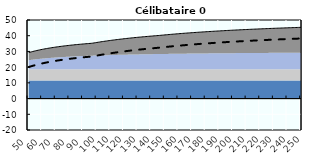
| Category | Coin fiscal moyen (somme des composantes) | Taux moyen d'imposition net en % du salaire brut |
|---|---|---|
| 50.0 | 29.264 | 20.068 |
| 51.0 | 29.505 | 20.341 |
| 52.0 | 29.738 | 20.604 |
| 53.0 | 29.962 | 20.857 |
| 54.0 | 30.177 | 21.1 |
| 55.0 | 30.385 | 21.335 |
| 56.0 | 30.585 | 21.561 |
| 57.0 | 30.778 | 21.779 |
| 58.0 | 30.964 | 21.99 |
| 59.0 | 31.144 | 22.193 |
| 60.0 | 31.319 | 22.39 |
| 61.0 | 31.487 | 22.58 |
| 62.0 | 31.65 | 22.765 |
| 63.0 | 31.808 | 22.943 |
| 64.0 | 31.961 | 23.116 |
| 65.0 | 32.109 | 23.283 |
| 66.0 | 32.253 | 23.445 |
| 67.0 | 32.392 | 23.603 |
| 68.0 | 32.527 | 23.756 |
| 69.0 | 32.659 | 23.904 |
| 70.0 | 32.786 | 24.049 |
| 71.0 | 32.91 | 24.189 |
| 72.0 | 33.031 | 24.325 |
| 73.0 | 33.148 | 24.458 |
| 74.0 | 33.262 | 24.586 |
| 75.0 | 33.373 | 24.712 |
| 76.0 | 33.482 | 24.834 |
| 77.0 | 33.587 | 24.953 |
| 78.0 | 33.69 | 25.069 |
| 79.0 | 33.79 | 25.182 |
| 80.0 | 33.887 | 25.292 |
| 81.0 | 33.982 | 25.4 |
| 82.0 | 34.075 | 25.505 |
| 83.0 | 34.166 | 25.607 |
| 84.0 | 34.254 | 25.707 |
| 85.0 | 34.34 | 25.805 |
| 86.0 | 34.425 | 25.9 |
| 87.0 | 34.507 | 25.993 |
| 88.0 | 34.588 | 26.084 |
| 89.0 | 34.666 | 26.173 |
| 90.0 | 34.743 | 26.26 |
| 91.0 | 34.819 | 26.345 |
| 92.0 | 34.892 | 26.428 |
| 93.0 | 34.964 | 26.51 |
| 94.0 | 35.035 | 26.589 |
| 95.0 | 35.104 | 26.667 |
| 96.0 | 35.171 | 26.744 |
| 97.0 | 35.268 | 26.852 |
| 98.0 | 35.417 | 27.021 |
| 99.0 | 35.564 | 27.187 |
| 100.0 | 35.707 | 27.349 |
| 101.0 | 35.848 | 27.508 |
| 102.0 | 35.986 | 27.664 |
| 103.0 | 36.121 | 27.816 |
| 104.0 | 36.253 | 27.966 |
| 105.0 | 36.383 | 28.113 |
| 106.0 | 36.511 | 28.257 |
| 107.0 | 36.636 | 28.399 |
| 108.0 | 36.759 | 28.538 |
| 109.0 | 36.88 | 28.674 |
| 110.0 | 36.998 | 28.808 |
| 111.0 | 37.115 | 28.94 |
| 112.0 | 37.229 | 29.069 |
| 113.0 | 37.341 | 29.195 |
| 114.0 | 37.451 | 29.32 |
| 115.0 | 37.56 | 29.443 |
| 116.0 | 37.666 | 29.563 |
| 117.0 | 37.771 | 29.681 |
| 118.0 | 37.874 | 29.797 |
| 119.0 | 37.975 | 29.912 |
| 120.0 | 38.074 | 30.024 |
| 121.0 | 38.172 | 30.135 |
| 122.0 | 38.268 | 30.243 |
| 123.0 | 38.363 | 30.35 |
| 124.0 | 38.456 | 30.456 |
| 125.0 | 38.548 | 30.559 |
| 126.0 | 38.638 | 30.661 |
| 127.0 | 38.727 | 30.761 |
| 128.0 | 38.814 | 30.86 |
| 129.0 | 38.9 | 30.957 |
| 130.0 | 38.985 | 31.053 |
| 131.0 | 39.068 | 31.147 |
| 132.0 | 39.151 | 31.24 |
| 133.0 | 39.231 | 31.332 |
| 134.0 | 39.311 | 31.422 |
| 135.0 | 39.39 | 31.51 |
| 136.0 | 39.467 | 31.598 |
| 137.0 | 39.543 | 31.684 |
| 138.0 | 39.618 | 31.769 |
| 139.0 | 39.692 | 31.852 |
| 140.0 | 39.765 | 31.935 |
| 141.0 | 39.837 | 32.016 |
| 142.0 | 39.908 | 32.096 |
| 143.0 | 39.978 | 32.175 |
| 144.0 | 40.047 | 32.253 |
| 145.0 | 40.115 | 32.33 |
| 146.0 | 40.191 | 32.416 |
| 147.0 | 40.276 | 32.511 |
| 148.0 | 40.359 | 32.605 |
| 149.0 | 40.441 | 32.698 |
| 150.0 | 40.521 | 32.789 |
| 151.0 | 40.601 | 32.879 |
| 152.0 | 40.68 | 32.968 |
| 153.0 | 40.758 | 33.056 |
| 154.0 | 40.834 | 33.143 |
| 155.0 | 40.91 | 33.228 |
| 156.0 | 40.985 | 33.313 |
| 157.0 | 41.059 | 33.396 |
| 158.0 | 41.131 | 33.478 |
| 159.0 | 41.203 | 33.56 |
| 160.0 | 41.274 | 33.64 |
| 161.0 | 41.344 | 33.719 |
| 162.0 | 41.414 | 33.797 |
| 163.0 | 41.482 | 33.875 |
| 164.0 | 41.55 | 33.951 |
| 165.0 | 41.616 | 34.027 |
| 166.0 | 41.682 | 34.101 |
| 167.0 | 41.748 | 34.175 |
| 168.0 | 41.812 | 34.248 |
| 169.0 | 41.876 | 34.319 |
| 170.0 | 41.939 | 34.391 |
| 171.0 | 42.001 | 34.461 |
| 172.0 | 42.062 | 34.53 |
| 173.0 | 42.123 | 34.599 |
| 174.0 | 42.183 | 34.667 |
| 175.0 | 42.242 | 34.734 |
| 176.0 | 42.301 | 34.8 |
| 177.0 | 42.359 | 34.865 |
| 178.0 | 42.416 | 34.93 |
| 179.0 | 42.473 | 34.994 |
| 180.0 | 42.529 | 35.058 |
| 181.0 | 42.584 | 35.12 |
| 182.0 | 42.639 | 35.182 |
| 183.0 | 42.693 | 35.244 |
| 184.0 | 42.747 | 35.304 |
| 185.0 | 42.8 | 35.364 |
| 186.0 | 42.853 | 35.424 |
| 187.0 | 42.905 | 35.482 |
| 188.0 | 42.956 | 35.54 |
| 189.0 | 43.007 | 35.598 |
| 190.0 | 43.057 | 35.655 |
| 191.0 | 43.107 | 35.711 |
| 192.0 | 43.156 | 35.767 |
| 193.0 | 43.205 | 35.822 |
| 194.0 | 43.253 | 35.876 |
| 195.0 | 43.301 | 35.93 |
| 196.0 | 43.348 | 35.984 |
| 197.0 | 43.395 | 36.036 |
| 198.0 | 43.441 | 36.089 |
| 199.0 | 43.487 | 36.141 |
| 200.0 | 43.533 | 36.192 |
| 201.0 | 43.578 | 36.243 |
| 202.0 | 43.622 | 36.293 |
| 203.0 | 43.666 | 36.343 |
| 204.0 | 43.71 | 36.392 |
| 205.0 | 43.753 | 36.441 |
| 206.0 | 43.796 | 36.489 |
| 207.0 | 43.838 | 36.537 |
| 208.0 | 43.88 | 36.585 |
| 209.0 | 43.922 | 36.632 |
| 210.0 | 43.963 | 36.678 |
| 211.0 | 44.004 | 36.724 |
| 212.0 | 44.044 | 36.77 |
| 213.0 | 44.084 | 36.815 |
| 214.0 | 44.124 | 36.86 |
| 215.0 | 44.163 | 36.904 |
| 216.0 | 44.202 | 36.948 |
| 217.0 | 44.24 | 36.992 |
| 218.0 | 44.279 | 37.035 |
| 219.0 | 44.316 | 37.078 |
| 220.0 | 44.354 | 37.12 |
| 221.0 | 44.391 | 37.162 |
| 222.0 | 44.428 | 37.204 |
| 223.0 | 44.464 | 37.245 |
| 224.0 | 44.501 | 37.286 |
| 225.0 | 44.536 | 37.326 |
| 226.0 | 44.572 | 37.366 |
| 227.0 | 44.607 | 37.406 |
| 228.0 | 44.642 | 37.446 |
| 229.0 | 44.677 | 37.485 |
| 230.0 | 44.711 | 37.523 |
| 231.0 | 44.745 | 37.562 |
| 232.0 | 44.779 | 37.6 |
| 233.0 | 44.812 | 37.638 |
| 234.0 | 44.845 | 37.675 |
| 235.0 | 44.878 | 37.712 |
| 236.0 | 44.911 | 37.749 |
| 237.0 | 44.943 | 37.786 |
| 238.0 | 44.975 | 37.822 |
| 239.0 | 45.007 | 37.858 |
| 240.0 | 45.038 | 37.893 |
| 241.0 | 45.07 | 37.929 |
| 242.0 | 45.101 | 37.964 |
| 243.0 | 45.131 | 37.998 |
| 244.0 | 45.162 | 38.033 |
| 245.0 | 45.192 | 38.067 |
| 246.0 | 45.222 | 38.101 |
| 247.0 | 45.252 | 38.134 |
| 248.0 | 45.281 | 38.168 |
| 249.0 | 45.31 | 38.201 |
| 250.0 | 45.339 | 38.234 |